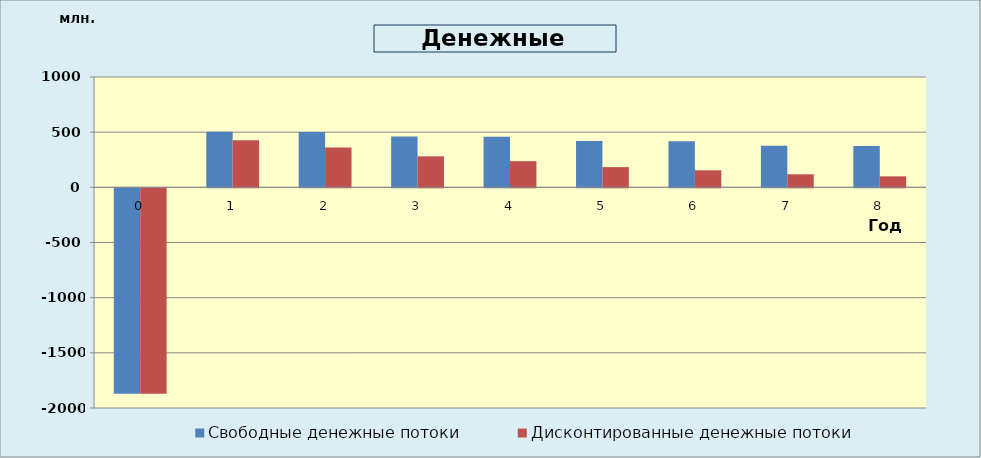
| Category | Свободные денежные потоки | Дисконтированные денежные потоки |
|---|---|---|
| 0.0 | -1861 | -1861 |
| 1.0 | 504.23 | 427.314 |
| 2.0 | 501.95 | 360.493 |
| 3.0 | 461.67 | 280.987 |
| 4.0 | 459.39 | 236.948 |
| 5.0 | 419.11 | 183.197 |
| 6.0 | 416.83 | 154.407 |
| 7.0 | 376.55 | 118.208 |
| 8.0 | 374.27 | 99.57 |